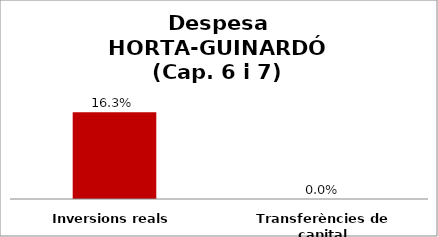
| Category | Series 0 |
|---|---|
| Inversions reals | 0.163 |
| Transferències de capital | 0 |